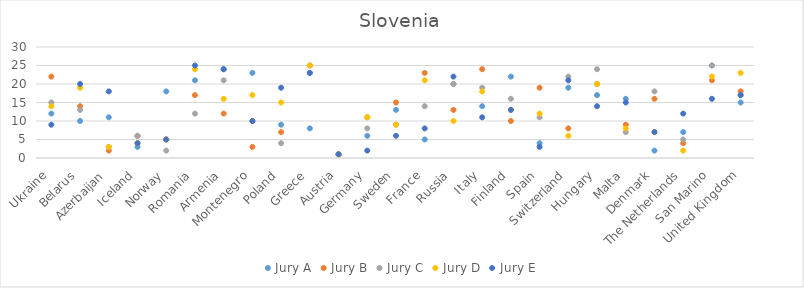
| Category | Jury A | Jury B | Jury C | Jury D | Jury E |
|---|---|---|---|---|---|
| Ukraine | 12 | 22 | 15 | 14 | 9 |
| Belarus | 10 | 14 | 13 | 19 | 20 |
| Azerbaijan | 11 | 2 | 3 | 3 | 18 |
| Iceland | 3 | 6 | 6 | 4 | 4 |
| Norway | 18 | 5 | 2 | 5 | 5 |
| Romania | 21 | 17 | 12 | 24 | 25 |
| Armenia | 24 | 12 | 21 | 16 | 24 |
| Montenegro | 23 | 3 | 10 | 17 | 10 |
| Poland | 9 | 7 | 4 | 15 | 19 |
| Greece | 8 | 25 | 23 | 25 | 23 |
| Austria | 1 | 1 | 1 | 1 | 1 |
| Germany | 6 | 11 | 8 | 11 | 2 |
| Sweden | 13 | 15 | 9 | 9 | 6 |
| France | 5 | 23 | 14 | 21 | 8 |
| Russia | 20 | 13 | 20 | 10 | 22 |
| Italy | 14 | 24 | 19 | 18 | 11 |
| Finland | 22 | 10 | 16 | 13 | 13 |
| Spain | 4 | 19 | 11 | 12 | 3 |
| Switzerland | 19 | 8 | 22 | 6 | 21 |
| Hungary | 17 | 20 | 24 | 20 | 14 |
| Malta | 16 | 9 | 7 | 8 | 15 |
| Denmark | 2 | 16 | 18 | 7 | 7 |
| The Netherlands | 7 | 4 | 5 | 2 | 12 |
| San Marino | 25 | 21 | 25 | 22 | 16 |
| United Kingdom | 15 | 18 | 17 | 23 | 17 |